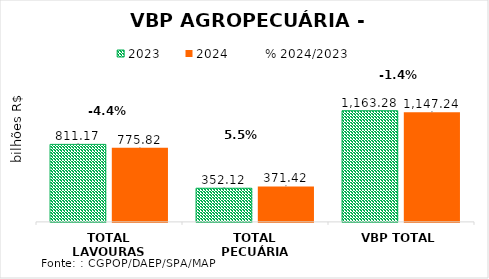
| Category | 2023 | 2024 |
|---|---|---|
| TOTAL LAVOURAS | 811.168 | 775.819 |
| TOTAL PECUÁRIA | 352.116 | 371.423 |
| VBP TOTAL | 1163.284 | 1147.242 |